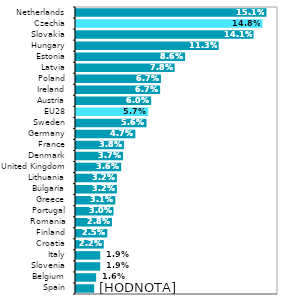
| Category | Series 0 |
|---|---|
| Spain | 0.014 |
| Belgium | 0.016 |
| Slovenia | 0.019 |
| Italy | 0.019 |
| Croatia | 0.022 |
| Finland | 0.025 |
| Romania | 0.028 |
| Portugal | 0.03 |
| Greece | 0.031 |
| Bulgaria | 0.032 |
| Lithuania | 0.032 |
| United Kingdom | 0.036 |
| Denmark | 0.037 |
| France | 0.038 |
| Germany | 0.047 |
| Sweden | 0.056 |
| EU28 | 0.057 |
| Austria | 0.06 |
| Ireland | 0.067 |
| Poland | 0.067 |
| Latvia | 0.078 |
| Estonia | 0.086 |
| Hungary | 0.113 |
| Slovakia | 0.141 |
| Czechia | 0.148 |
| Netherlands | 0.151 |